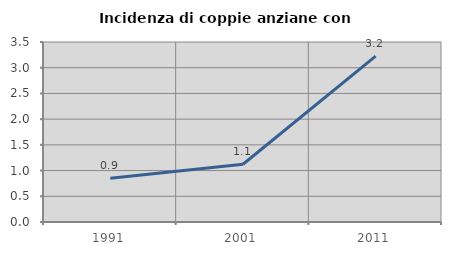
| Category | Incidenza di coppie anziane con figli |
|---|---|
| 1991.0 | 0.851 |
| 2001.0 | 1.124 |
| 2011.0 | 3.226 |